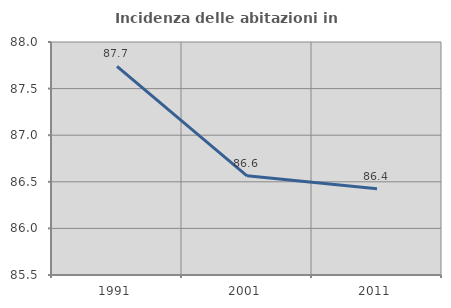
| Category | Incidenza delle abitazioni in proprietà  |
|---|---|
| 1991.0 | 87.738 |
| 2001.0 | 86.564 |
| 2011.0 | 86.426 |